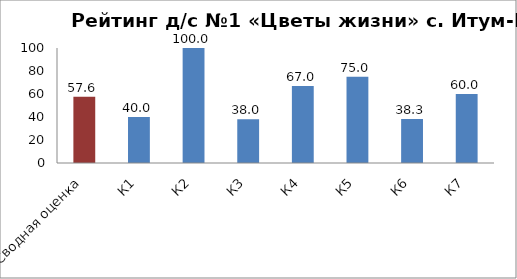
| Category | Series 0 |
|---|---|
| Сводная оценка | 57.583 |
| К1 | 40 |
| К2 | 100 |
| К3 | 38 |
| К4 | 67 |
| К5 | 75 |
| К6 | 38.33 |
| К7 | 60 |